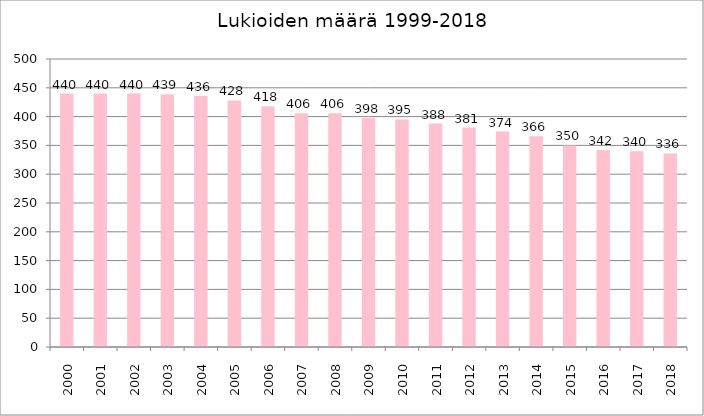
| Category | Lukioiden määrä |
|---|---|
| 2000.0 | 440 |
| 2001.0 | 440 |
| 2002.0 | 440 |
| 2003.0 | 439 |
| 2004.0 | 436 |
| 2005.0 | 428 |
| 2006.0 | 418 |
| 2007.0 | 406 |
| 2008.0 | 406 |
| 2009.0 | 398 |
| 2010.0 | 395 |
| 2011.0 | 388 |
| 2012.0 | 381 |
| 2013.0 | 374 |
| 2014.0 | 366 |
| 2015.0 | 350 |
| 2016.0 | 342 |
| 2017.0 | 340 |
| 2018.0 | 336 |